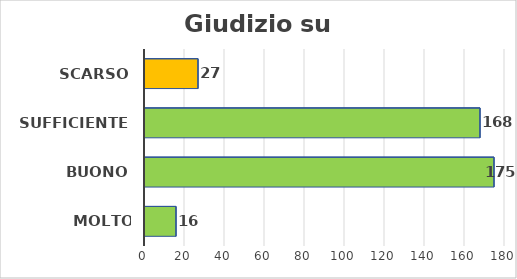
| Category | Giudizio su sanità |
|---|---|
| Molto buono | 16 |
| Buono | 175 |
| Sufficiente | 168 |
| Scarso | 27 |